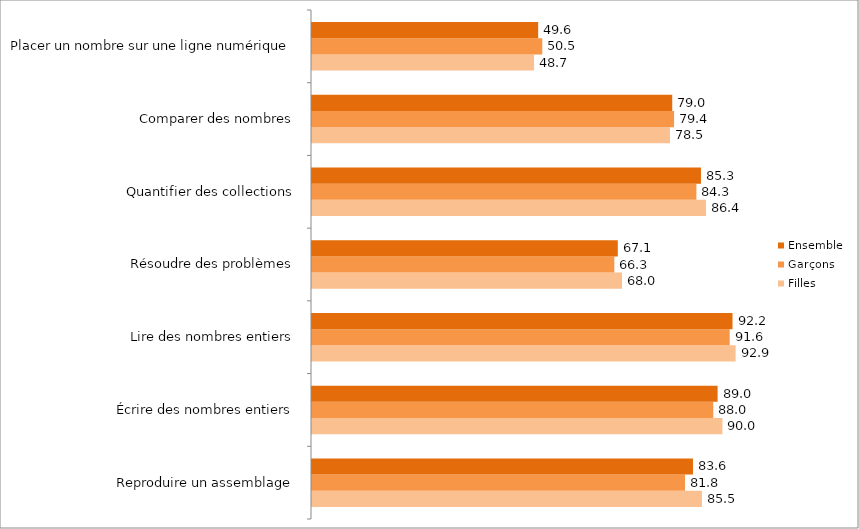
| Category | Filles | Garçons | Ensemble |
|---|---|---|---|
| Reproduire un assemblage | 85.5 | 81.8 | 83.55 |
| Écrire des nombres entiers | 90 | 88 | 88.95 |
| Lire des nombres entiers | 92.9 | 91.6 | 92.22 |
| Résoudre des problèmes | 68 | 66.3 | 67.06 |
| Quantifier des collections | 86.4 | 84.3 | 85.3 |
| Comparer des nombres | 78.5 | 79.4 | 79 |
| Placer un nombre sur une ligne numérique | 48.7 | 50.5 | 49.6 |